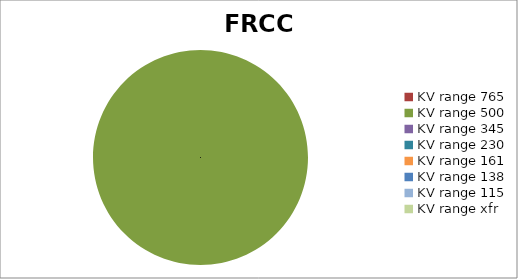
| Category | FRCC |
|---|---|
| 0 | 0 |
| 1 | 2 |
| 2 | 0 |
| 3 | 0 |
| 4 | 0 |
| 5 | 0 |
| 6 | 0 |
| 7 | 0 |